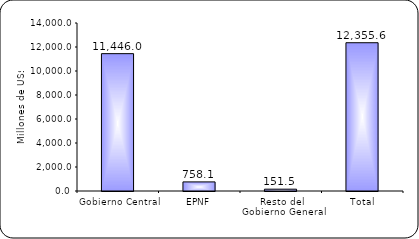
| Category | Series 1 |
|---|---|
| Gobierno Central | 11446 |
| EPNF | 758.1 |
| Resto del Gobierno General | 151.5 |
| Total | 12355.6 |